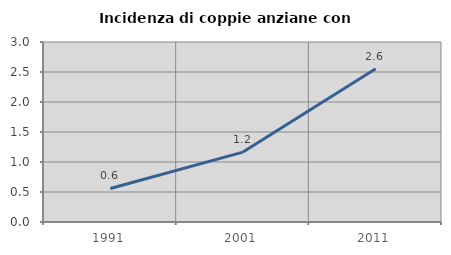
| Category | Incidenza di coppie anziane con figli |
|---|---|
| 1991.0 | 0.559 |
| 2001.0 | 1.165 |
| 2011.0 | 2.555 |